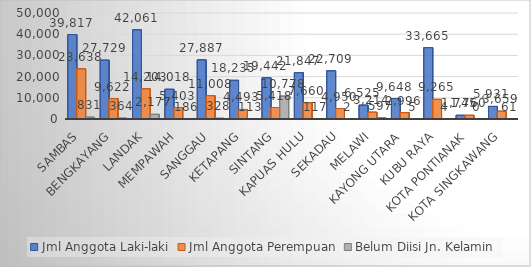
| Category | Jml Anggota Laki-laki | Jml Anggota Perempuan | Belum Diisi Jn. Kelamin |
|---|---|---|---|
| Sambas | 39817 | 23638 | 831 |
| Bengkayang | 27729 | 9622 | 364 |
| Landak | 42061 | 14203 | 2177 |
| Mempawah | 14018 | 5403 | 186 |
| Sanggau | 27887 | 11008 | 328 |
| Ketapang | 18235 | 4493 | 113 |
| Sintang | 19442 | 5418 | 10778 |
| Kapuas Hulu | 21847 | 7660 | 117 |
| Sekadau | 22709 | 4950 | 2 |
| Melawi | 6525 | 3214 | 597 |
| Kayong Utara | 9648 | 2996 | 5 |
| Kubu Raya | 33665 | 9265 | 4 |
| Kota Pontianak | 1745 | 1760 | 0 |
| Kota Singkawang | 5931 | 3659 | 61 |